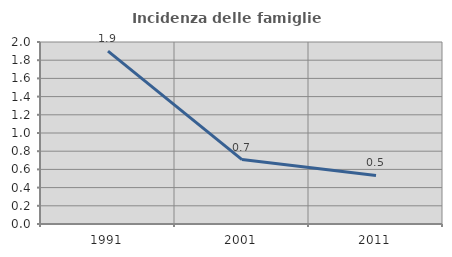
| Category | Incidenza delle famiglie numerose |
|---|---|
| 1991.0 | 1.9 |
| 2001.0 | 0.708 |
| 2011.0 | 0.534 |